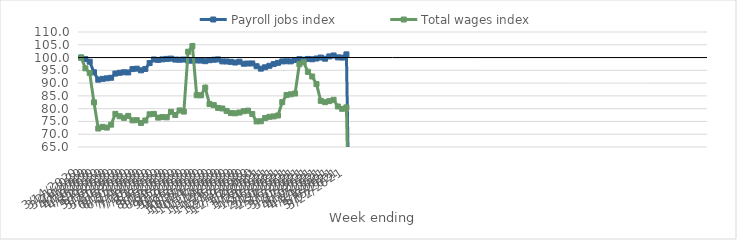
| Category | Payroll jobs index | Total wages index |
|---|---|---|
| 14/03/2020 | 100 | 100 |
| 21/03/2020 | 99.378 | 95.784 |
| 28/03/2020 | 98.37 | 93.956 |
| 04/04/2020 | 94.243 | 82.465 |
| 11/04/2020 | 91.352 | 72.234 |
| 18/04/2020 | 91.668 | 72.859 |
| 25/04/2020 | 91.87 | 72.594 |
| 02/05/2020 | 92.09 | 73.74 |
| 09/05/2020 | 93.739 | 77.957 |
| 16/05/2020 | 94.037 | 77.04 |
| 23/05/2020 | 94.238 | 76.401 |
| 30/05/2020 | 94.174 | 77.173 |
| 06/06/2020 | 95.488 | 75.424 |
| 13/06/2020 | 95.653 | 75.499 |
| 20/06/2020 | 95.008 | 74.398 |
| 27/06/2020 | 95.535 | 75.367 |
| 04/07/2020 | 97.844 | 77.801 |
| 11/07/2020 | 99.251 | 77.952 |
| 18/07/2020 | 99.076 | 76.502 |
| 25/07/2020 | 99.294 | 76.707 |
| 01/08/2020 | 99.482 | 76.611 |
| 08/08/2020 | 99.582 | 78.762 |
| 15/08/2020 | 99.199 | 77.521 |
| 22/08/2020 | 99.145 | 79.314 |
| 29/08/2020 | 99.226 | 78.852 |
| 05/09/2020 | 98.805 | 102.278 |
| 12/09/2020 | 98.776 | 104.493 |
| 19/09/2020 | 98.862 | 85.261 |
| 26/09/2020 | 98.828 | 85.225 |
| 03/10/2020 | 98.575 | 88.229 |
| 10/10/2020 | 98.958 | 81.784 |
| 17/10/2020 | 99.145 | 81.377 |
| 24/10/2020 | 99.274 | 80.303 |
| 31/10/2020 | 98.493 | 80.083 |
| 07/11/2020 | 98.461 | 79.125 |
| 14/11/2020 | 98.317 | 78.279 |
| 21/11/2020 | 98.048 | 78.182 |
| 28/11/2020 | 98.37 | 78.487 |
| 05/12/2020 | 97.587 | 79.01 |
| 12/12/2020 | 97.666 | 79.237 |
| 19/12/2020 | 97.695 | 77.903 |
| 26/12/2020 | 96.605 | 75.013 |
| 02/01/2021 | 95.658 | 75.066 |
| 09/01/2021 | 96.197 | 76.328 |
| 16/01/2021 | 96.778 | 76.813 |
| 23/01/2021 | 97.444 | 76.971 |
| 30/01/2021 | 97.93 | 77.337 |
| 06/02/2021 | 98.492 | 82.552 |
| 13/02/2021 | 98.546 | 85.33 |
| 20/02/2021 | 98.506 | 85.628 |
| 27/02/2021 | 99.036 | 85.929 |
| 06/03/2021 | 99.356 | 97.389 |
| 13/03/2021 | 99.169 | 98.186 |
| 20/03/2021 | 99.458 | 94.415 |
| 27/03/2021 | 99.323 | 92.595 |
| 03/04/2021 | 99.63 | 89.629 |
| 10/04/2021 | 100.004 | 83.065 |
| 17/04/2021 | 99.546 | 82.546 |
| 24/04/2021 | 100.448 | 82.951 |
| 01/05/2021 | 100.815 | 83.467 |
| 08/05/2021 | 100.067 | 80.858 |
| 15/05/2021 | 99.992 | 79.942 |
| 22/05/2021 | 101.242 | 80.513 |